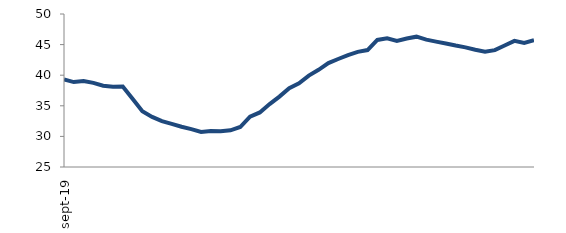
| Category | Series 0 |
|---|---|
| 2019-09-01 | 39.294 |
| 2019-10-01 | 38.876 |
| 2019-11-01 | 39.061 |
| 2019-12-01 | 38.744 |
| 2020-01-01 | 38.288 |
| 2020-02-01 | 38.128 |
| 2020-03-01 | 38.143 |
| 2020-04-01 | 36.141 |
| 2020-05-01 | 34.114 |
| 2020-06-01 | 33.191 |
| 2020-07-01 | 32.506 |
| 2020-08-01 | 32.045 |
| 2020-09-01 | 31.572 |
| 2020-10-01 | 31.184 |
| 2020-11-01 | 30.726 |
| 2020-12-01 | 30.899 |
| 2021-01-01 | 30.834 |
| 2021-02-01 | 30.995 |
| 2021-03-01 | 31.535 |
| 2021-04-01 | 33.22 |
| 2021-05-01 | 33.912 |
| 2021-06-01 | 35.282 |
| 2021-07-01 | 36.501 |
| 2021-08-01 | 37.863 |
| 2021-09-01 | 38.674 |
| 2021-10-01 | 39.929 |
| 2021-11-01 | 40.877 |
| 2021-12-01 | 41.971 |
| 2022-01-01 | 42.648 |
| 2022-02-01 | 43.291 |
| 2022-03-01 | 43.809 |
| 2022-04-01 | 44.109 |
| 2022-05-01 | 45.766 |
| 2022-06-01 | 46.018 |
| 2022-07-01 | 45.603 |
| 2022-08-01 | 45.994 |
| 2022-09-01 | 46.295 |
| 2022-10-01 | 45.815 |
| 2022-11-01 | 45.487 |
| 2022-12-01 | 45.174 |
| 2023-01-01 | 44.844 |
| 2023-02-01 | 44.552 |
| 2023-03-01 | 44.166 |
| 2023-04-01 | 43.838 |
| 2023-05-01 | 44.095 |
| 2023-06-01 | 44.849 |
| 2023-07-01 | 45.617 |
| 2023-08-01 | 45.254 |
| 2023-09-01 | 45.708 |